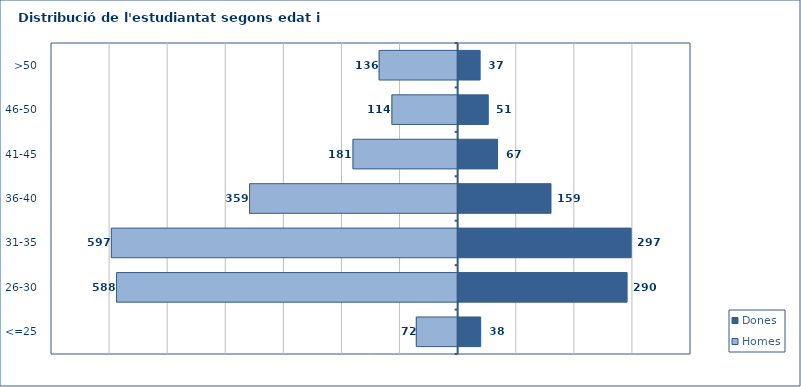
| Category | Homes | Dones |
|---|---|---|
| <=25 | -72 | 38 |
| 26-30 | -588 | 290 |
| 31-35 | -597 | 297 |
| 36-40 | -359 | 159 |
| 41-45 | -181 | 67 |
| 46-50 | -114 | 51 |
| >50 | -136 | 37 |